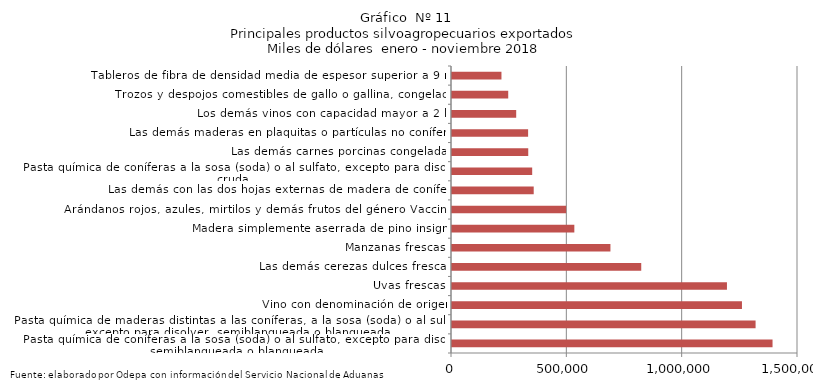
| Category | Series 0 |
|---|---|
| Pasta química de coníferas a la sosa (soda) o al sulfato, excepto para disolver, semiblanqueada o blanqueada | 1389632.098 |
| Pasta química de maderas distintas a las coníferas, a la sosa (soda) o al sulfato, excepto para disolver, semiblanqueada o blanqueada | 1316100.249 |
| Vino con denominación de origen | 1257067.791 |
| Uvas frescas | 1191995.995 |
| Las demás cerezas dulces frescas | 820397.273 |
| Manzanas frescas | 686853.532 |
| Madera simplemente aserrada de pino insigne | 530348.928 |
| Arándanos rojos, azules, mirtilos y demás frutos del género Vaccinium | 494799.303 |
| Las demás con las dos hojas externas de madera de coníferas | 354239.095 |
| Pasta química de coníferas a la sosa (soda) o al sulfato, excepto para disolver, cruda | 347626.746 |
| Las demás carnes porcinas congeladas | 330532.376 |
| Las demás maderas en plaquitas o partículas no coníferas | 329984.125 |
| Los demás vinos con capacidad mayor a 2 lts | 278291.224 |
| Trozos y despojos comestibles de gallo o gallina, congelados | 243747.749 |
| Tableros de fibra de densidad media de espesor superior a 9 mm | 214422.733 |